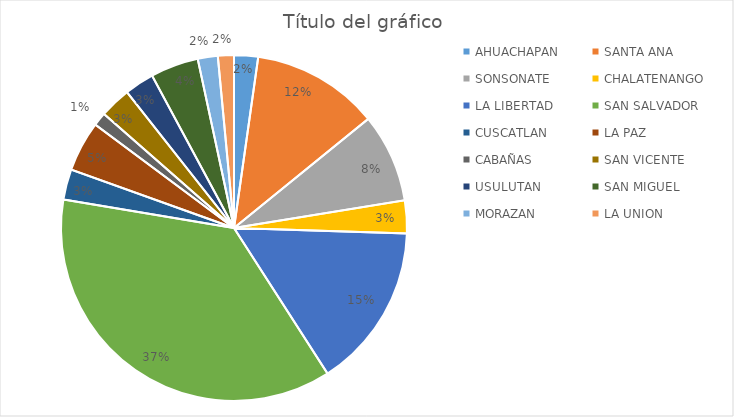
| Category | 2013 | 2014 | 2015 | 2016 | 2017 | 2018 | 2019 |
|---|---|---|---|---|---|---|---|
| AHUACHAPAN | 30 | 47 | 16 | 14 | 20 | 35 | 23 |
| SANTA ANA | 159 | 122 | 52 | 47 | 68 | 145 | 89 |
| SONSONATE | 111 | 91 | 21 | 22 | 30 | 119 | 71 |
| CHALATENANGO | 41 | 48 | 2 | 5 | 19 | 51 | 34 |
| LA LIBERTAD | 206 | 118 | 35 | 67 | 76 | 179 | 108 |
| SAN SALVADOR | 491 | 327 | 71 | 87 | 160 | 479 | 270 |
| CUSCATLAN | 38 | 23 | 3 | 7 | 4 | 26 | 24 |
| LA PAZ | 63 | 69 | 22 | 30 | 48 | 125 | 45 |
| CABAÑAS | 17 | 21 | 3 | 1 | 9 | 28 | 7 |
| SAN VICENTE | 39 | 32 | 8 | 5 | 24 | 58 | 16 |
| USULUTAN | 37 | 30 | 7 | 7 | 9 | 35 | 20 |
| SAN MIGUEL | 60 | 38 | 4 | 1 | 8 | 25 | 33 |
| MORAZAN | 25 | 11 | 0 | 1 | 47 | 14 | 11 |
| LA UNION | 20 | 13 | 1 | 3 | 2 | 9 | 9 |